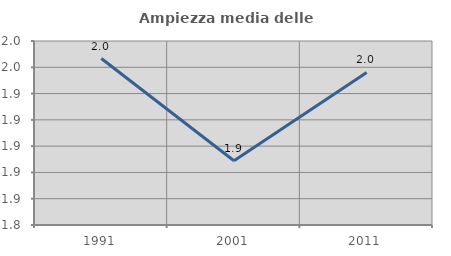
| Category | Ampiezza media delle famiglie |
|---|---|
| 1991.0 | 1.967 |
| 2001.0 | 1.889 |
| 2011.0 | 1.956 |